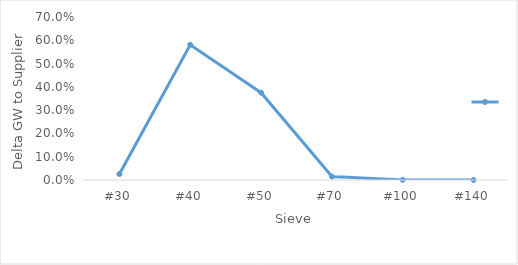
| Category | Series 0 |
|---|---|
| #30 | 0.026 |
| #40 | 0.581 |
| #50 | 0.375 |
| #70 | 0.015 |
| #100 | 0 |
| #140 | 0 |